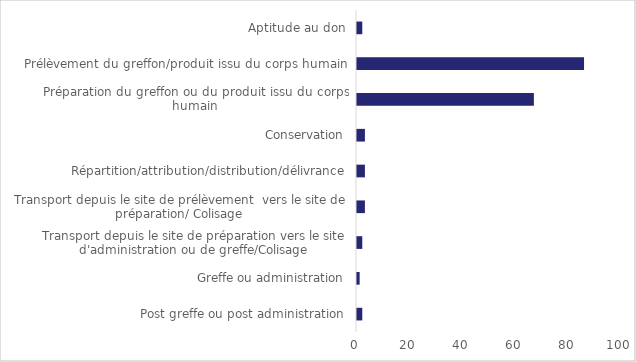
| Category | Nombre de déclarations |
|---|---|
| Post greffe ou post administration | 2 |
| Greffe ou administration | 1 |
| Transport depuis le site de préparation vers le site d'administration ou de greffe/Colisage | 2 |
| Transport depuis le site de prélèvement  vers le site de préparation/ Colisage | 3 |
| Répartition/attribution/distribution/délivrance | 3 |
| Conservation | 3 |
| Préparation du greffon ou du produit issu du corps humain | 67 |
| Prélèvement du greffon/produit issu du corps humain | 86 |
| Aptitude au don | 2 |